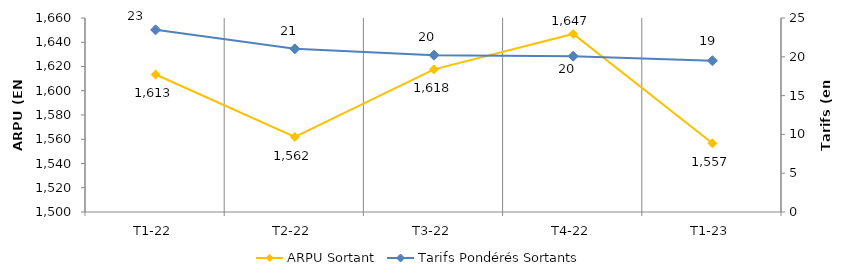
| Category | ARPU Sortant |
|---|---|
| T1-22 | 1613.421 |
| T2-22 | 1561.879 |
| T3-22 | 1617.612 |
| T4-22 | 1646.839 |
| T1-23 | 1556.725 |